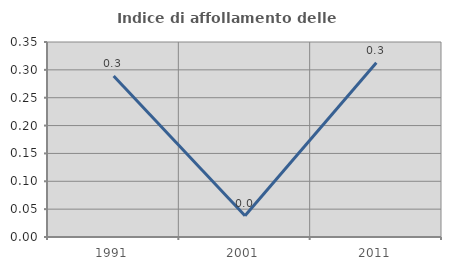
| Category | Indice di affollamento delle abitazioni  |
|---|---|
| 1991.0 | 0.289 |
| 2001.0 | 0.038 |
| 2011.0 | 0.313 |